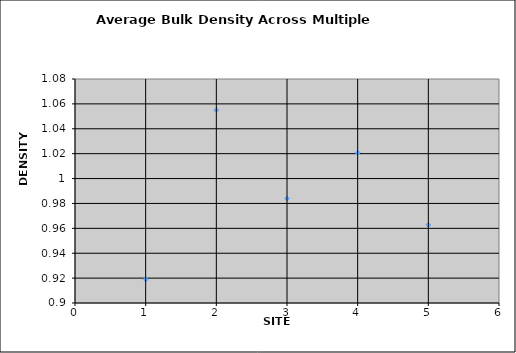
| Category | DENSITY |
|---|---|
| 1.0 | 0.919 |
| 2.0 | 1.055 |
| 3.0 | 0.984 |
| 4.0 | 1.021 |
| 5.0 | 0.963 |